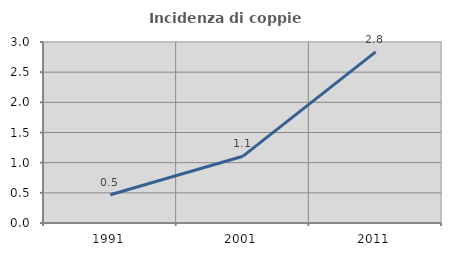
| Category | Incidenza di coppie miste |
|---|---|
| 1991.0 | 0.467 |
| 2001.0 | 1.107 |
| 2011.0 | 2.836 |